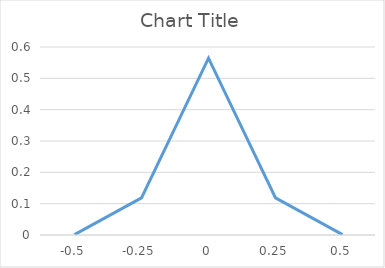
| Category | Series 0 |
|---|---|
| -0.5 | 0.001 |
| -0.25 | 0.118 |
| 0.0 | 0.564 |
| 0.25 | 0.118 |
| 0.5 | 0.001 |